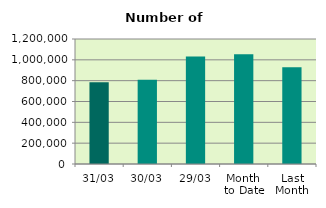
| Category | Series 0 |
|---|---|
| 31/03 | 783734 |
| 30/03 | 809042 |
| 29/03 | 1032876 |
| Month 
to Date | 1053589.478 |
| Last
Month | 928647.7 |